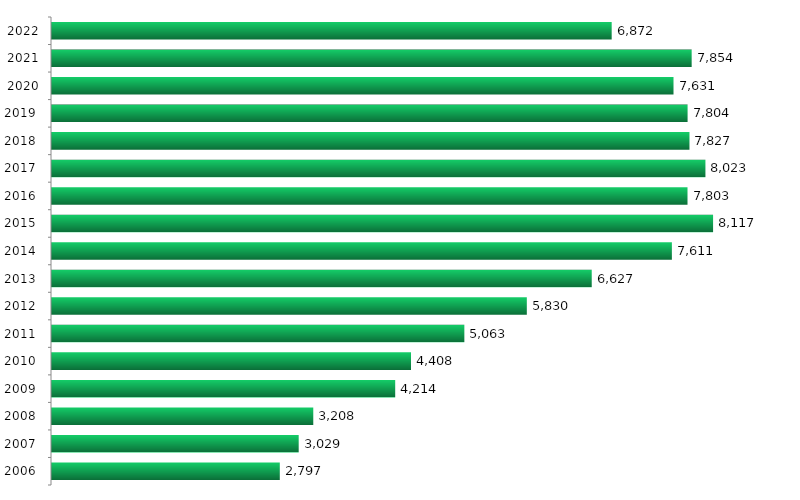
| Category | Series 0 |
|---|---|
| 2006.0 | 2797 |
| 2007.0 | 3029 |
| 2008.0 | 3208 |
| 2009.0 | 4214 |
| 2010.0 | 4408 |
| 2011.0 | 5063 |
| 2012.0 | 5830 |
| 2013.0 | 6627 |
| 2014.0 | 7611 |
| 2015.0 | 8117 |
| 2016.0 | 7803 |
| 2017.0 | 8023 |
| 2018.0 | 7827 |
| 2019.0 | 7804 |
| 2020.0 | 7631 |
| 2021.0 | 7854 |
| 2022.0 | 6872 |